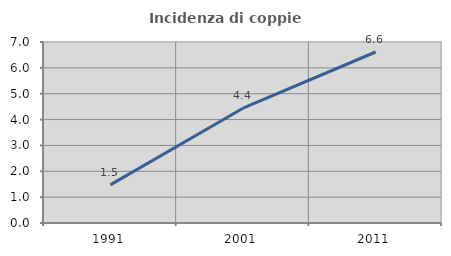
| Category | Incidenza di coppie miste |
|---|---|
| 1991.0 | 1.475 |
| 2001.0 | 4.441 |
| 2011.0 | 6.613 |